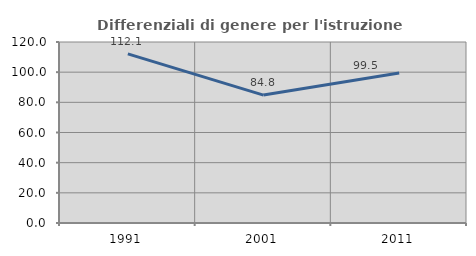
| Category | Differenziali di genere per l'istruzione superiore |
|---|---|
| 1991.0 | 112.094 |
| 2001.0 | 84.818 |
| 2011.0 | 99.503 |